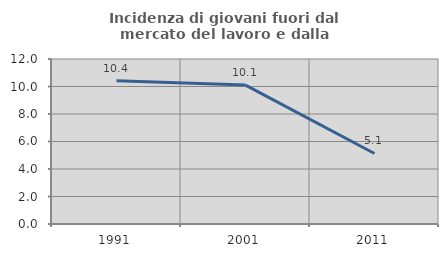
| Category | Incidenza di giovani fuori dal mercato del lavoro e dalla formazione  |
|---|---|
| 1991.0 | 10.417 |
| 2001.0 | 10.101 |
| 2011.0 | 5.128 |